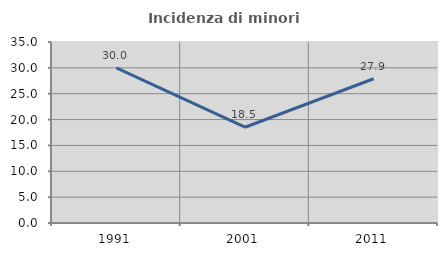
| Category | Incidenza di minori stranieri |
|---|---|
| 1991.0 | 30 |
| 2001.0 | 18.519 |
| 2011.0 | 27.891 |